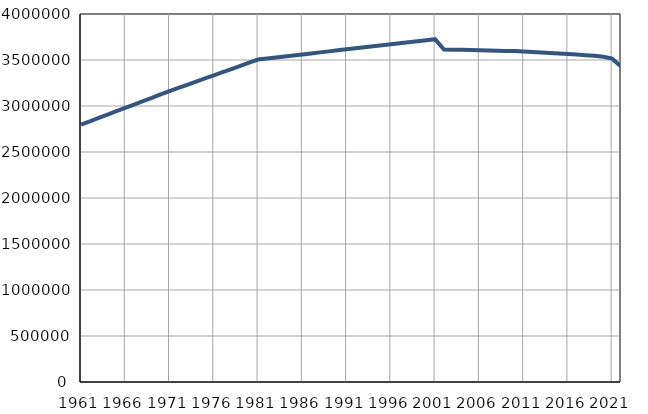
| Category | Population
size |
|---|---|
| 1961.0 | 2797161 |
| 1962.0 | 2833637 |
| 1963.0 | 2870114 |
| 1964.0 | 2906589 |
| 1965.0 | 2943066 |
| 1966.0 | 2979541 |
| 1967.0 | 3016016 |
| 1968.0 | 3052493 |
| 1969.0 | 3088968 |
| 1970.0 | 3125444 |
| 1971.0 | 3161920 |
| 1972.0 | 3196214 |
| 1973.0 | 3230507 |
| 1974.0 | 3264801 |
| 1975.0 | 3299093 |
| 1976.0 | 3333392 |
| 1977.0 | 3367682 |
| 1978.0 | 3401975 |
| 1979.0 | 3436268 |
| 1980.0 | 3470562 |
| 1981.0 | 3504855 |
| 1982.0 | 3515981 |
| 1983.0 | 3527107 |
| 1984.0 | 3538233 |
| 1985.0 | 3549358 |
| 1986.0 | 3560487 |
| 1987.0 | 3571612 |
| 1988.0 | 3582737 |
| 1989.0 | 3593862 |
| 1990.0 | 3604989 |
| 1991.0 | 3616115 |
| 1992.0 | 3627143 |
| 1993.0 | 3638171 |
| 1994.0 | 3649198 |
| 1995.0 | 3660228 |
| 1996.0 | 3671254 |
| 1997.0 | 3682284 |
| 1998.0 | 3693310 |
| 1999.0 | 3704338 |
| 2000.0 | 3715366 |
| 2001.0 | 3726395 |
| 2002.0 | 3613215 |
| 2003.0 | 3612062 |
| 2004.0 | 3611517 |
| 2005.0 | 3609837 |
| 2006.0 | 3605459 |
| 2007.0 | 3602840 |
| 2008.0 | 3600785 |
| 2009.0 | 3598938 |
| 2010.0 | 3597090 |
| 2011.0 | 3591096 |
| 2012.0 | 3586235 |
| 2013.0 | 3581647 |
| 2014.0 | 3576978 |
| 2015.0 | 3571596 |
| 2016.0 | 3565319 |
| 2017.0 | 3558647 |
| 2018.0 | 3552056 |
| 2019.0 | 3546149 |
| 2020.0 | 3535332 |
| 2021.0 | 3514649 |
| 2022.0 | 3428249 |